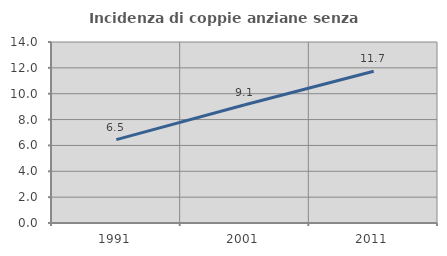
| Category | Incidenza di coppie anziane senza figli  |
|---|---|
| 1991.0 | 6.452 |
| 2001.0 | 9.143 |
| 2011.0 | 11.741 |